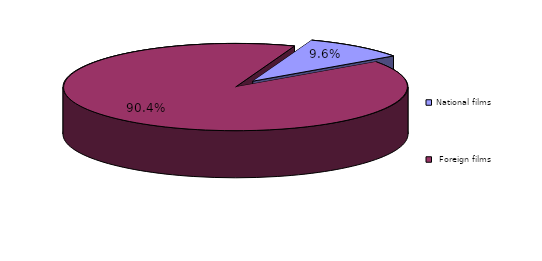
| Category | Series 0 |
|---|---|
| National films | 60 |
|  Foreign films  | 563 |